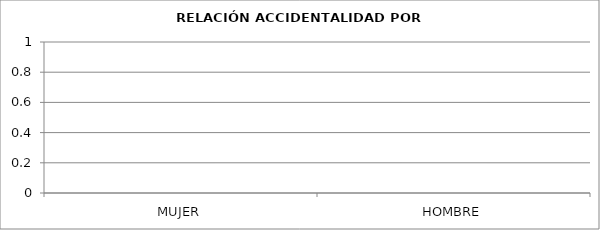
| Category | CANTIDAD |
|---|---|
| MUJER | 0 |
| HOMBRE | 0 |